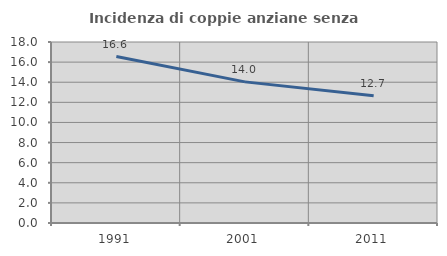
| Category | Incidenza di coppie anziane senza figli  |
|---|---|
| 1991.0 | 16.556 |
| 2001.0 | 14.035 |
| 2011.0 | 12.651 |